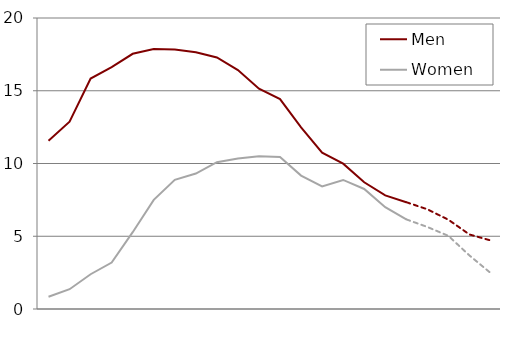
| Category | Men | Women |
|---|---|---|
| 1887.5 | 11.57 | 0.84 |
| 1892.5 | 12.87 | 1.36 |
| 1897.5 | 15.84 | 2.39 |
| 1902.5 | 16.62 | 3.19 |
| 1907.5 | 17.54 | 5.28 |
| 1912.5 | 17.87 | 7.5 |
| 1917.5 | 17.84 | 8.88 |
| 1922.5 | 17.65 | 9.31 |
| 1927.5 | 17.29 | 10.09 |
| 1932.5 | 16.42 | 10.35 |
| 1937.5 | 15.14 | 10.49 |
| 1942.5 | 14.43 | 10.45 |
| 1947.5 | 12.49 | 9.17 |
| 1952.5 | 10.75 | 8.43 |
| 1957.5 | 9.99 | 8.87 |
| 1962.5 | 8.71 | 8.25 |
| 1967.5 | 7.81 | 7 |
| 1972.5 | 7.34 | 6.16 |
| 1977.5 | 6.853 | 5.639 |
| 1982.5 | 6.136 | 5.027 |
| 1987.5 | 5.123 | 3.68 |
| 1992.5 | 4.713 | 2.482 |